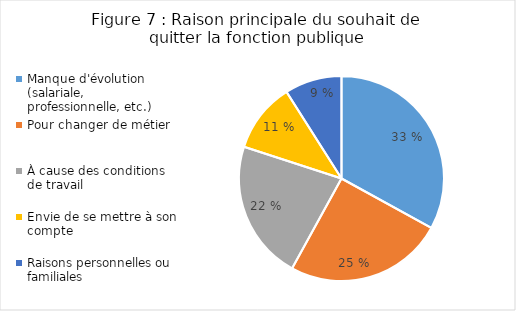
| Category | Series 0 |
|---|---|
| Manque d'évolution (salariale, professionnelle, etc.) | 0.33 |
| Pour changer de métier | 0.25 |
| À cause des conditions de travail | 0.22 |
| Envie de se mettre à son compte | 0.11 |
| Raisons personnelles ou familiales | 0.09 |